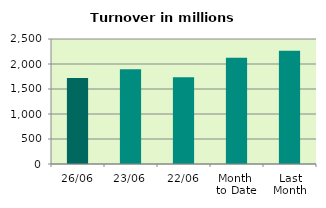
| Category | Series 0 |
|---|---|
| 26/06 | 1720.307 |
| 23/06 | 1893.083 |
| 22/06 | 1737.128 |
| Month 
to Date | 2122.605 |
| Last
Month | 2265.206 |